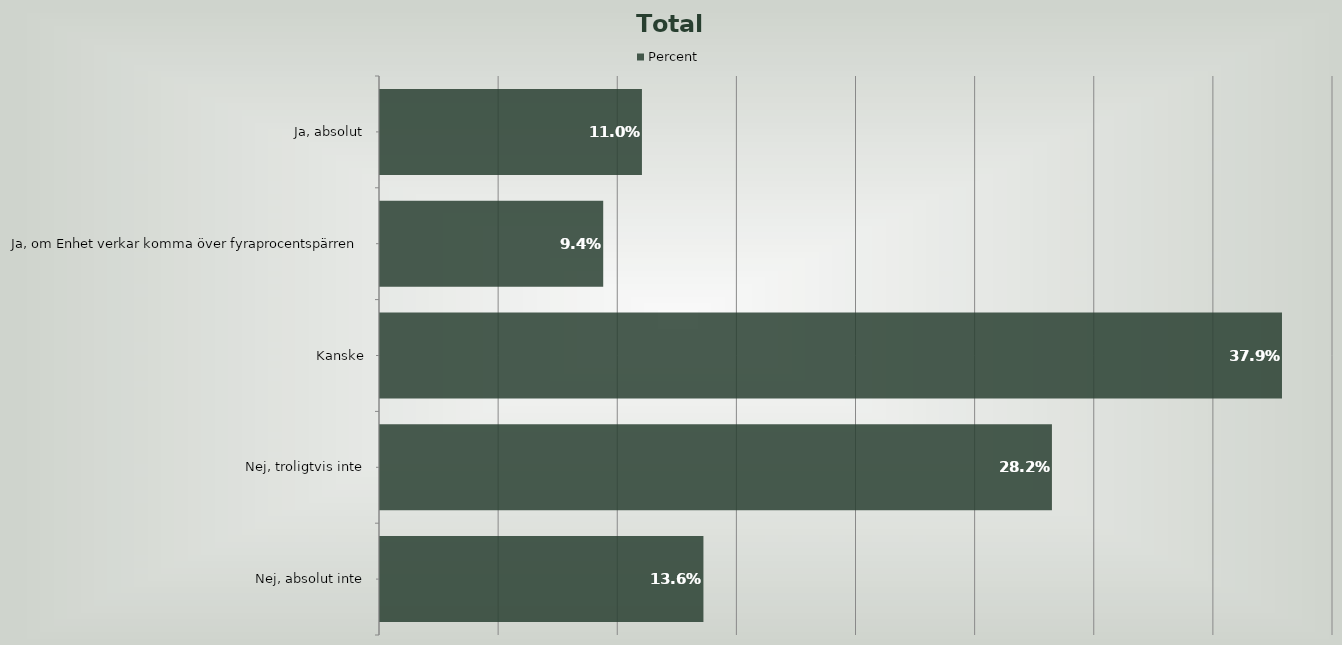
| Category | Percent |
|---|---|
| Ja, absolut | 0.11 |
| Ja, om Enhet verkar komma över fyraprocentspärren | 0.094 |
| Kanske | 0.379 |
| Nej, troligtvis inte | 0.282 |
| Nej, absolut inte | 0.136 |